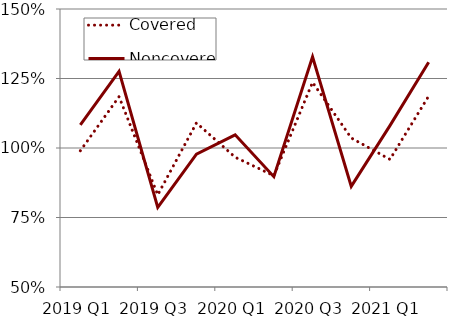
| Category | Covered | Noncovered |
|---|---|---|
| 2019 Q1 | 0.99 | 1.083 |
| 2019 Q2 | 1.185 | 1.276 |
| 2019 Q3 | 0.831 | 0.786 |
| 2019 Q4 | 1.09 | 0.978 |
| 2020 Q1 | 0.967 | 1.047 |
| 2020 Q2 | 0.9 | 0.897 |
| 2020 Q3 | 1.236 | 1.328 |
| 2020 Q4 | 1.036 | 0.862 |
| 2021 Q1 | 0.959 | 1.081 |
| 2021 Q2 | 1.186 | 1.308 |